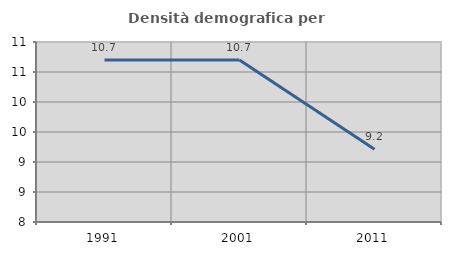
| Category | Densità demografica |
|---|---|
| 1991.0 | 10.702 |
| 2001.0 | 10.702 |
| 2011.0 | 9.211 |